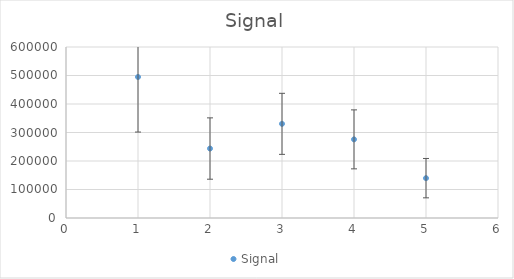
| Category | Signal |
|---|---|
| 0 | 494821.404 |
| 1 | 243721.88 |
| 2 | 330388.041 |
| 3 | 275907.23 |
| 4 | 139809.177 |